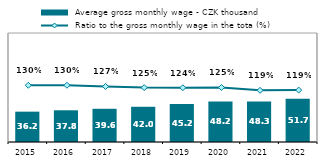
| Category |  Average gross monthly wage - CZK thousand |
|---|---|
| 2015.0 | 36.187 |
| 2016.0 | 37.825 |
| 2017.0 | 39.612 |
| 2018.0 | 42.016 |
| 2019.0 | 45.219 |
| 2020.0 | 48.175 |
| 2021.0 | 48.322 |
| 2022.0 | 51.688 |